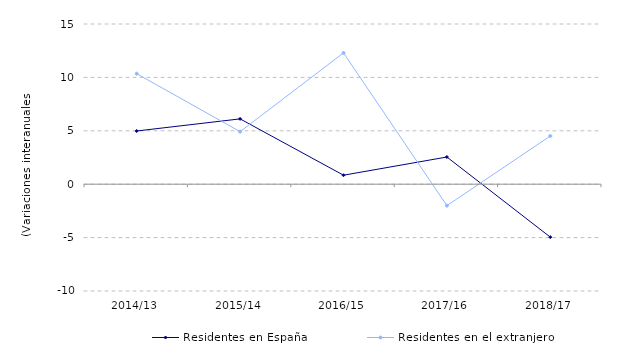
| Category | Residentes en España | Residentes en el extranjero |
|---|---|---|
| 2014/13 | 4.981 | 10.349 |
| 2015/14 | 6.116 | 4.921 |
| 2016/15 | 0.842 | 12.291 |
| 2017/16 | 2.546 | -2.007 |
| 2018/17 | -4.956 | 4.513 |